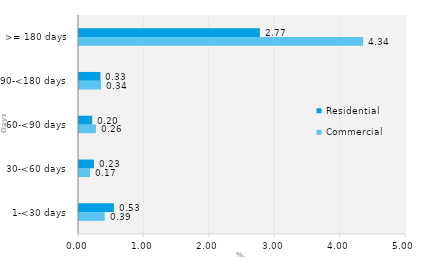
| Category | Commercial | Residential |
|---|---|---|
| 1-<30 days | 0.393 | 0.533 |
| 30-<60 days | 0.168 | 0.229 |
| 60-<90 days | 0.258 | 0.202 |
| 90-<180 days | 0.336 | 0.328 |
| >= 180 days | 4.343 | 2.765 |